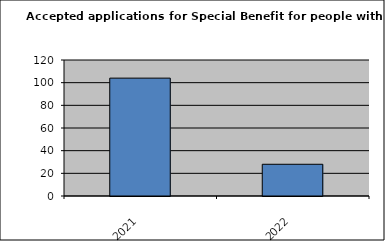
| Category | Series 1 |
|---|---|
| 2021.0 | 104 |
| 2022.0 | 28 |